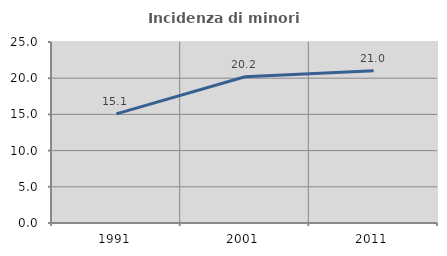
| Category | Incidenza di minori stranieri |
|---|---|
| 1991.0 | 15.067 |
| 2001.0 | 20.201 |
| 2011.0 | 21.025 |